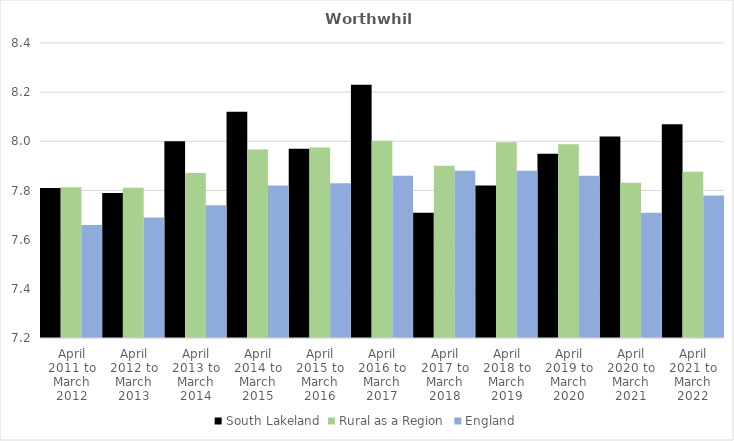
| Category | South Lakeland | Rural as a Region | England |
|---|---|---|---|
| April 2011 to March 2012 | 7.81 | 7.813 | 7.66 |
| April 2012 to March 2013 | 7.79 | 7.811 | 7.69 |
| April 2013 to March 2014 | 8 | 7.871 | 7.74 |
| April 2014 to March 2015 | 8.12 | 7.967 | 7.82 |
| April 2015 to March 2016 | 7.97 | 7.975 | 7.83 |
| April 2016 to March 2017 | 8.23 | 8.002 | 7.86 |
| April 2017 to March 2018 | 7.71 | 7.9 | 7.88 |
| April 2018 to March 2019 | 7.82 | 7.996 | 7.88 |
| April 2019 to March 2020 | 7.95 | 7.988 | 7.86 |
| April 2020 to March 2021 | 8.02 | 7.831 | 7.71 |
| April 2021 to March 2022 | 8.07 | 7.877 | 7.78 |